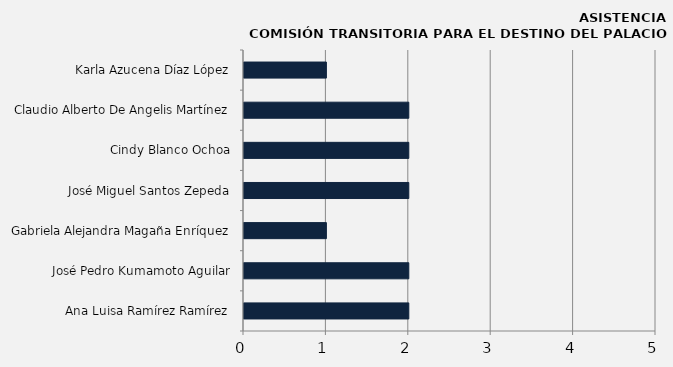
| Category | Ana Luisa Ramírez Ramírez |
|---|---|
| Ana Luisa Ramírez Ramírez | 2 |
| José Pedro Kumamoto Aguilar | 2 |
| Gabriela Alejandra Magaña Enríquez | 1 |
| José Miguel Santos Zepeda | 2 |
| Cindy Blanco Ochoa | 2 |
| Claudio Alberto De Angelis Martínez | 2 |
| Karla Azucena Díaz López | 1 |